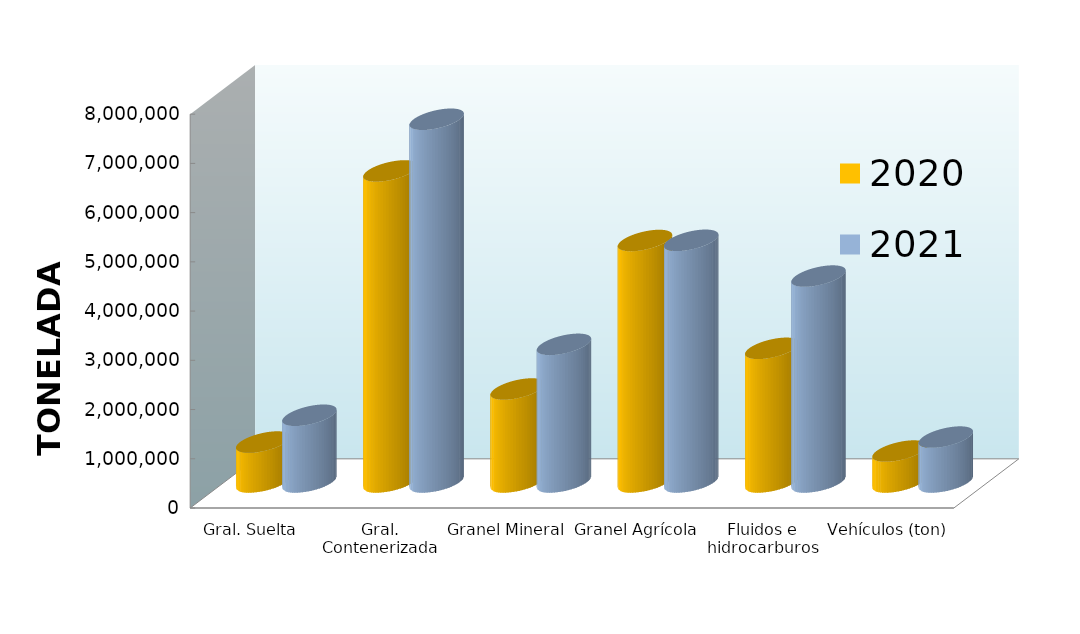
| Category | 2020 | 2021 |
|---|---|---|
| Gral. Suelta | 811198.451 | 1355617.042 |
| Gral. Contenerizada | 6318344.18 | 7367987.825 |
| Granel Mineral | 1888808.567 | 2795956.408 |
| Granel Agrícola | 4905211.837 | 4909353.266 |
| Fluidos e hidrocarburos | 2715091.442 | 4182583.132 |
| Vehículos (ton) | 627948.192 | 912149.118 |